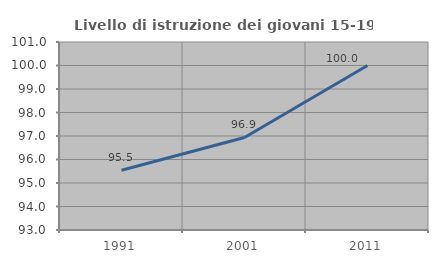
| Category | Livello di istruzione dei giovani 15-19 anni |
|---|---|
| 1991.0 | 95.541 |
| 2001.0 | 96.939 |
| 2011.0 | 100 |